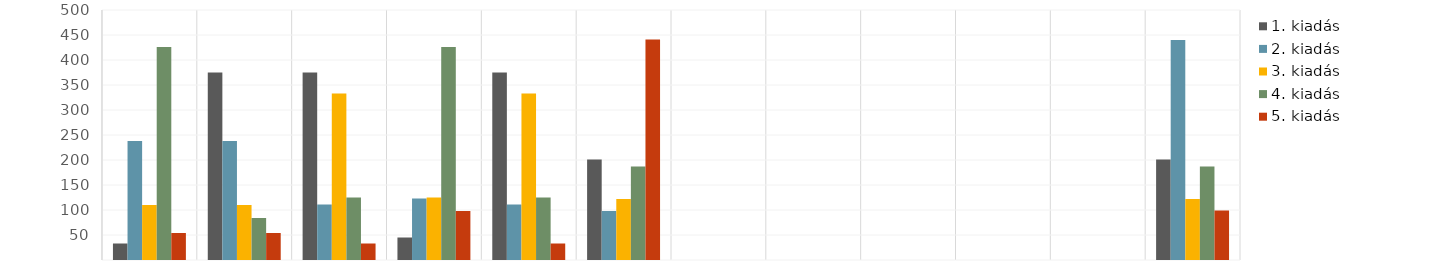
| Category | 1. kiadás | 2. kiadás | 3. kiadás | 4. kiadás | 5. kiadás |
|---|---|---|---|---|---|
| Jan. | 33 | 238 | 110 | 426 | 54 |
| Febr. | 375 | 238 | 110 | 84 | 54 |
| Márc. | 375 | 111 | 333 | 125 | 33 |
| Ápr. | 45 | 123 | 125 | 426 | 98 |
| Máj. | 375 | 111 | 333 | 125 | 33 |
| Jún. | 201 | 98 | 122 | 187 | 441 |
| Júl. | 0 | 0 | 0 | 0 | 0 |
| Aug. | 0 | 0 | 0 | 0 | 0 |
| Szept. | 0 | 0 | 0 | 0 | 0 |
| Okt. | 0 | 0 | 0 | 0 | 0 |
| Nov. | 0 | 0 | 0 | 0 | 0 |
| Dec. | 201 | 440 | 122 | 187 | 99 |